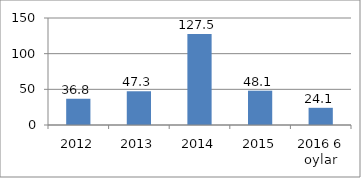
| Category | Series 0 |
|---|---|
| 2012 | 36.8 |
| 2013 | 47.3 |
| 2014 | 127.5 |
| 2015 | 48.1 |
| 2016 6 oylar | 24.1 |